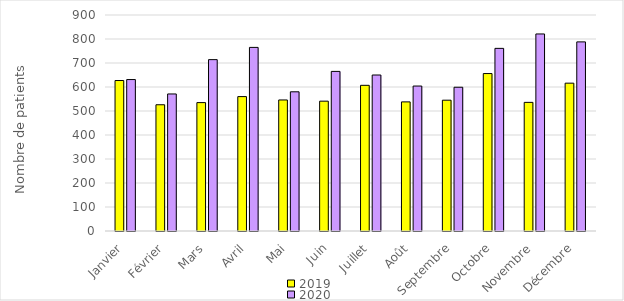
| Category | 2019 | 2020 |
|---|---|---|
| Janvier | 627 | 631 |
| Février | 526 | 571 |
| Mars | 535 | 714 |
| Avril | 560 | 765 |
| Mai | 546 | 580 |
| Juin | 541 | 665 |
| Juillet | 607 | 650 |
| Août | 538 | 604 |
| Septembre | 545 | 599 |
| Octobre | 656 | 761 |
| Novembre | 536 | 821 |
| Décembre | 616 | 788 |